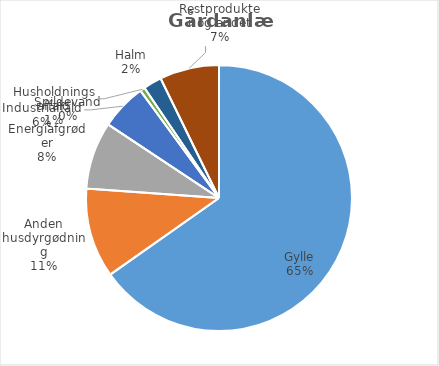
| Category | Series 0 |
|---|---|
| Gylle | 1548567.97 |
| Anden husdyrgødning | 258642.92 |
| Energiafgrøder | 194458.37 |
| Spildevand | 0 |
| Industriaffald | 133277.71 |
| Husholdningsaffald | 13993 |
| Halm | 53308.9 |
| Restprodukter og andet | 171606.84 |